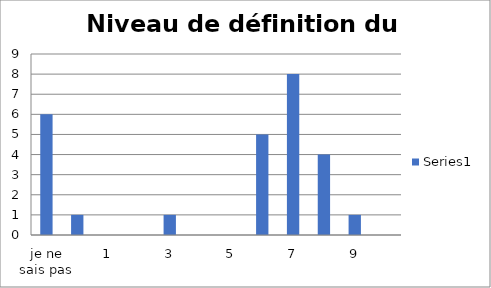
| Category | Series 0 |
|---|---|
| je ne sais pas | 6 |
| 0 | 1 |
| 1 | 0 |
| 2 | 0 |
| 3 | 1 |
| 4 | 0 |
| 5 | 0 |
| 6 | 5 |
| 7 | 8 |
| 8 | 4 |
| 9 | 1 |
| 10 | 0 |